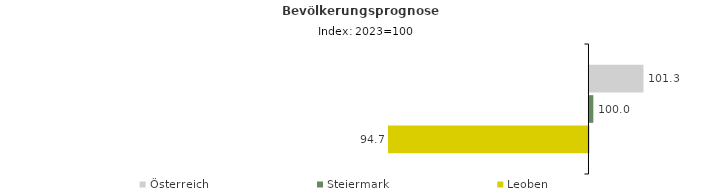
| Category | Österreich | Steiermark | Leoben |
|---|---|---|---|
| 2023.0 | 101.3 | 100 | 94.7 |